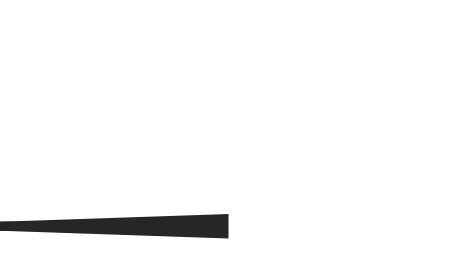
| Category | x |
|---|---|
| 0.0 | 0 |
| 50.0 | 2 |
| 50.0 | -2 |
| 0.0 | 0 |
| 50.0 | 0 |